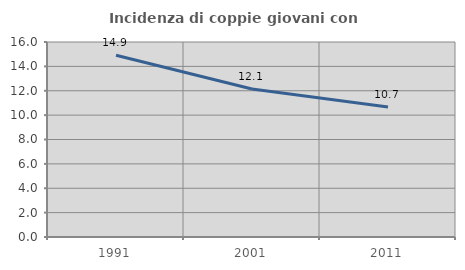
| Category | Incidenza di coppie giovani con figli |
|---|---|
| 1991.0 | 14.911 |
| 2001.0 | 12.14 |
| 2011.0 | 10.663 |